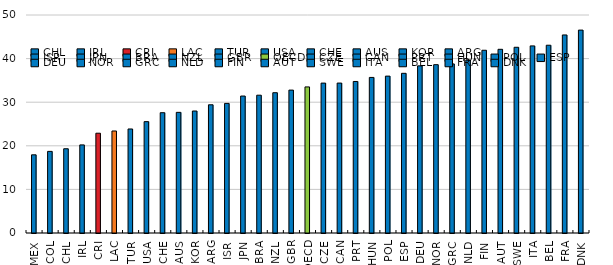
| Category | Total tax rev as % of GDP |
|---|---|
| MEX | 17.933 |
| COL | 18.718 |
| CHL | 19.324 |
| IRL | 20.204 |
| CRI | 22.887 |
| LAC | 23.397 |
| TUR | 23.86 |
| USA | 25.539 |
| CHE | 27.588 |
| AUS | 27.673 |
| KOR | 27.979 |
| ARG | 29.407 |
| ISR | 29.725 |
| JPN | 31.412 |
| BRA | 31.606 |
| NZL | 32.177 |
| GBR | 32.774 |
| OECD | 33.506 |
| CZE | 34.382 |
| CAN | 34.389 |
| PRT | 34.754 |
| HUN | 35.68 |
| POL | 35.981 |
| ESP | 36.624 |
| DEU | 38.335 |
| NOR | 38.608 |
| GRC | 38.781 |
| NLD | 39.676 |
| FIN | 41.913 |
| AUT | 42.132 |
| SWE | 42.597 |
| ITA | 42.912 |
| BEL | 43.067 |
| FRA | 45.427 |
| DNK | 46.537 |